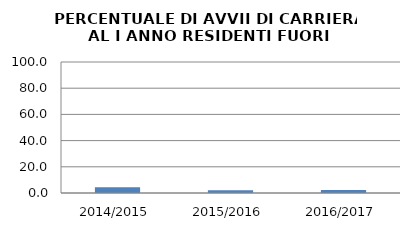
| Category | 2014/2015 2015/2016 2016/2017 |
|---|---|
| 2014/2015 | 4.418 |
| 2015/2016 | 2.02 |
| 2016/2017 | 2.26 |